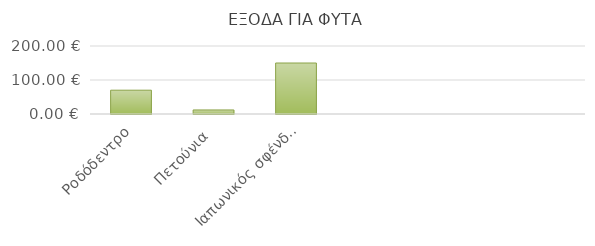
| Category | Ροδόδεντρο |
|---|---|
| Ροδόδεντρο | 70 |
| Πετούνια | 11.94 |
| Ιαπωνικός σφένδαμος | 150 |